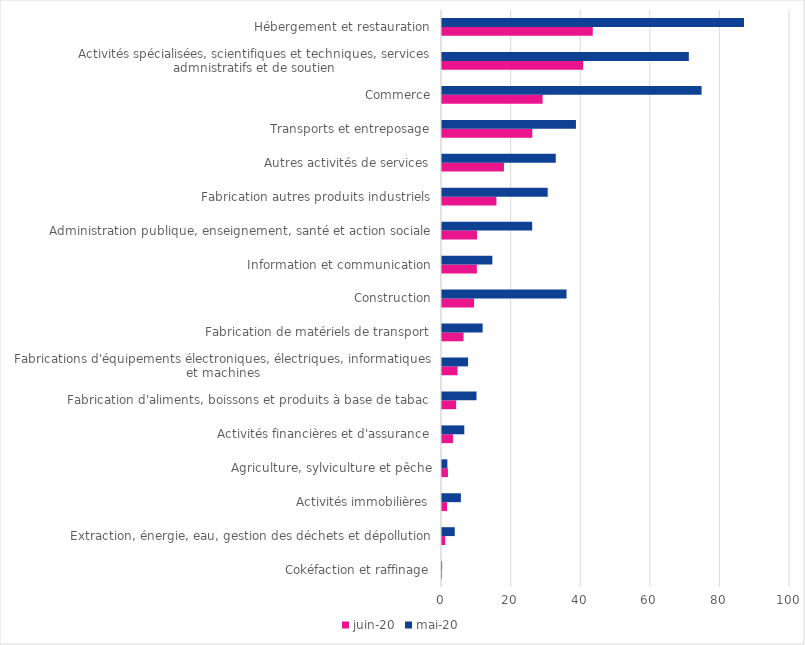
| Category | juin-20 | mai-20 |
|---|---|---|
| Cokéfaction et raffinage | 0.012 | 0.038 |
| Extraction, énergie, eau, gestion des déchets et dépollution | 0.913 | 3.67 |
| Activités immobilières | 1.451 | 5.422 |
| Agriculture, sylviculture et pêche | 1.704 | 1.542 |
| Activités financières et d'assurance | 3.146 | 6.407 |
| Fabrication d'aliments, boissons et produits à base de tabac | 4.066 | 9.912 |
| Fabrications d'équipements électroniques, électriques, informatiques et machines | 4.461 | 7.496 |
| Fabrication de matériels de transport | 6.185 | 11.667 |
| Construction | 9.211 | 35.786 |
| Information et communication | 10.021 | 14.469 |
| Administration publique, enseignement, santé et action sociale | 10.081 | 25.913 |
| Fabrication autres produits industriels | 15.635 | 30.373 |
| Autres activités de services | 17.796 | 32.693 |
| Transports et entreposage | 25.945 | 38.492 |
| Commerce | 28.907 | 74.591 |
| Activités spécialisées, scientifiques et techniques, services admnistratifs et de soutien | 40.558 | 70.928 |
| Hébergement et restauration | 43.317 | 86.784 |